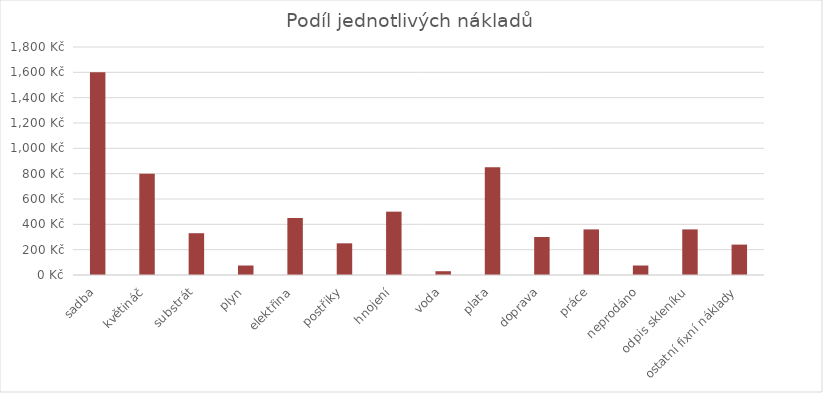
| Category | 1 600 Kč |
|---|---|
| sadba | 1600 |
| květináč | 800 |
| substrát | 330 |
| plyn | 75 |
| elektřina | 450 |
| postřiky | 250 |
| hnojení | 500 |
| voda | 30 |
| plata | 850 |
| doprava | 300 |
| práce | 360 |
| neprodáno | 75 |
| odpis skleníku | 360 |
| ostatní fixní náklady | 240 |